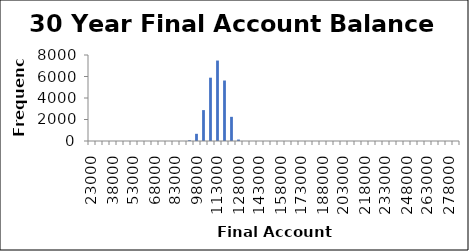
| Category | Frequency |
|---|---|
| 23000.0 | 0 |
| 28000.0 | 0 |
| 33000.0 | 0 |
| 38000.0 | 0 |
| 43000.0 | 0 |
| 48000.0 | 0 |
| 53000.0 | 0 |
| 58000.0 | 0 |
| 63000.0 | 0 |
| 68000.0 | 0 |
| 73000.0 | 0 |
| 78000.0 | 0 |
| 83000.0 | 0 |
| 88000.0 | 0 |
| 93000.0 | 74 |
| 98000.0 | 669 |
| 103000.0 | 2874 |
| 108000.0 | 5889 |
| 113000.0 | 7484 |
| 118000.0 | 5627 |
| 123000.0 | 2248 |
| 128000.0 | 135 |
| 133000.0 | 0 |
| 138000.0 | 0 |
| 143000.0 | 0 |
| 148000.0 | 0 |
| 153000.0 | 0 |
| 158000.0 | 0 |
| 163000.0 | 0 |
| 168000.0 | 0 |
| 173000.0 | 0 |
| 178000.0 | 0 |
| 183000.0 | 0 |
| 188000.0 | 0 |
| 193000.0 | 0 |
| 198000.0 | 0 |
| 203000.0 | 0 |
| 208000.0 | 0 |
| 213000.0 | 0 |
| 218000.0 | 0 |
| 223000.0 | 0 |
| 228000.0 | 0 |
| 233000.0 | 0 |
| 238000.0 | 0 |
| 243000.0 | 0 |
| 248000.0 | 0 |
| 253000.0 | 0 |
| 258000.0 | 0 |
| 263000.0 | 0 |
| 268000.0 | 0 |
| 273000.0 | 0 |
| 278000.0 | 0 |
| More | 0 |